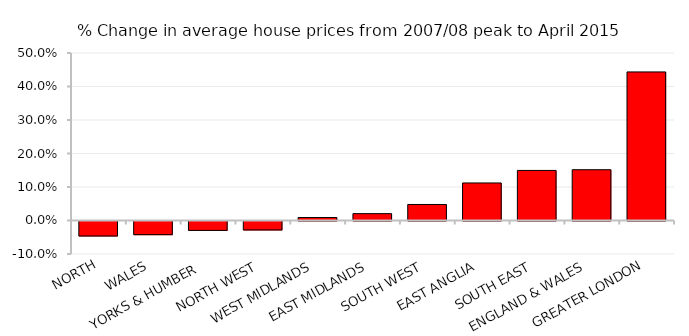
| Category | % Change |
|---|---|
| NORTH | -0.045 |
| WALES | -0.041 |
| YORKS & HUMBER  | -0.028 |
| NORTH WEST | -0.027 |
| WEST MIDLANDS | 0.009 |
| EAST MIDLANDS | 0.02 |
| SOUTH WEST | 0.048 |
| EAST ANGLIA | 0.112 |
| SOUTH EAST | 0.149 |
| ENGLAND & WALES | 0.152 |
| GREATER LONDON | 0.443 |